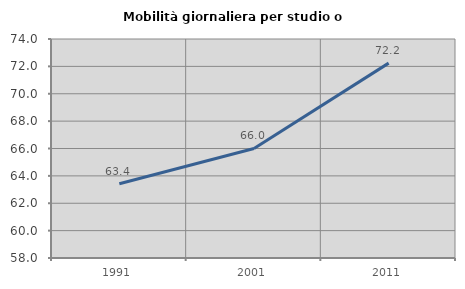
| Category | Mobilità giornaliera per studio o lavoro |
|---|---|
| 1991.0 | 63.42 |
| 2001.0 | 66.004 |
| 2011.0 | 72.238 |